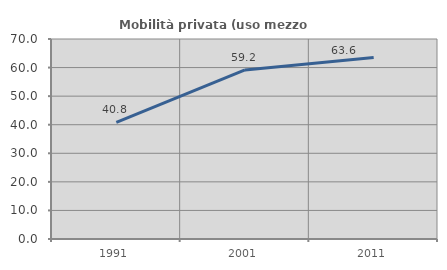
| Category | Mobilità privata (uso mezzo privato) |
|---|---|
| 1991.0 | 40.801 |
| 2001.0 | 59.183 |
| 2011.0 | 63.563 |